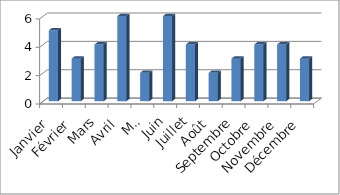
| Category | Oslo |
|---|---|
| Janvier | 5 |
| Février | 3 |
| Mars | 4 |
| Avril | 6 |
| Mai | 2 |
| Juin | 6 |
| Juillet | 4 |
| Août | 2 |
| Septembre | 3 |
| Octobre | 4 |
| Novembre | 4 |
| Décembre | 3 |